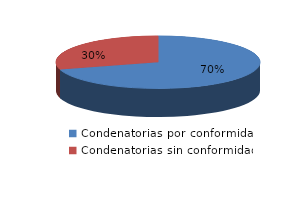
| Category | Series 0 |
|---|---|
| 0 | 573 |
| 1 | 240 |